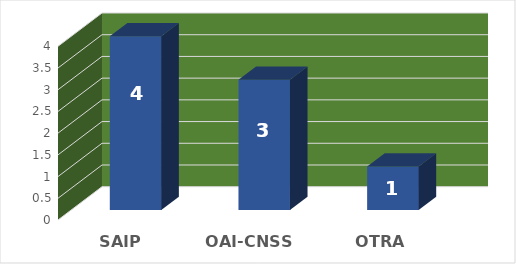
| Category | Series 0 |
|---|---|
| SAIP | 4 |
| OAI-CNSS | 3 |
| OTRA ENTIDAD | 1 |